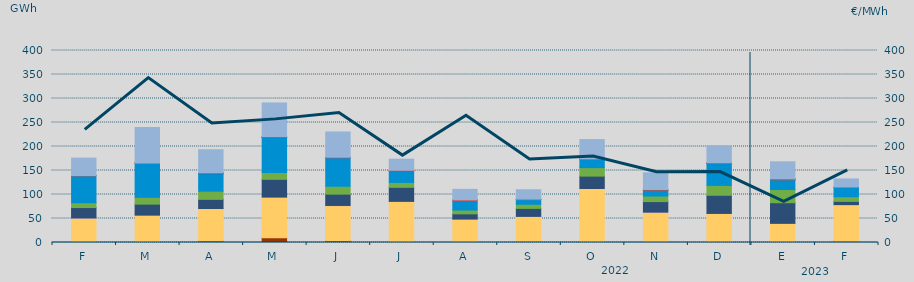
| Category | Carbón | Ciclo Combinado | Cogeneración | Consumo Bombeo | Eólica | Hidráulica | Nuclear | Otras Renovables | Solar fotovoltaica | Solar térmica | Turbinación bombeo |
|---|---|---|---|---|---|---|---|---|---|---|---|
| F | 1422.4 | 49296.1 | 416.6 | 21707.5 | 9996.4 | 56385.2 | 0 | 0 | 73.3 | 57.8 | 36436.3 |
| M | 696.5 | 56010.8 | 391.8 | 22798.3 | 14218 | 71626.6 | 0 | 7.4 | 87.7 | 6.7 | 73580.2 |
| A | 3349.534 | 67415.187 | 93.591 | 18989.102 | 17056.874 | 36445.011 | 1248.7 | 45.8 | 106.634 | 333.066 | 48166.851 |
| M | 10012.495 | 84316.131 | 342.191 | 36920.803 | 14355.123 | 73448.126 | 0.3 | 0 | 350.4 | 549.325 | 70399.534 |
| J | 3803.776 | 72994.164 | 408.816 | 23523.459 | 16484.811 | 59296.475 | 327.825 | 3.325 | 281.65 | 342.175 | 52808.788 |
| J | 2026.357 | 83630.229 | 62.5 | 29193.443 | 10247.658 | 24517.982 | 107.35 | 0 | 186.925 | 340.15 | 23284.195 |
| A | 608.425 | 48201.184 | 25.75 | 10881.743 | 7912.923 | 20661.25 | 49.5 | 8.225 | 251.425 | 88.725 | 21982.08 |
| S | 2432.475 | 52018.85 | 0.5 | 16627 | 8549.825 | 9810.3 | 0 | 23 | 777.175 | 6.75 | 19642.325 |
| O | 1876.1 | 110603.205 | 45 | 25745.4 | 17659.375 | 17006.05 | 12.825 | 16.6 | 1409.775 | 15.5 | 40055.836 |
| N | 1396.025 | 61724.955 | 198.008 | 21869.975 | 11579.495 | 12449.175 | 266.725 | 0 | 996.225 | 0 | 34713.224 |
| D | 1126.208 | 59335.684 | 104.85 | 37837.8 | 20596.98 | 45465.168 | 544.3 | 0 | 1011.875 | 1.5 | 35471.986 |
| E | 478.95 | 39423.05 | 26.617 | 42912.617 | 27499.217 | 20419.292 | 13.625 | 0 | 2540.742 | 1.5 | 34818.533 |
| F | 2850.925 | 76083.275 | 1.55 | 6739.65 | 9661.175 | 19240.1 | 0 | 0 | 962.675 | 47.25 | 16781.025 |